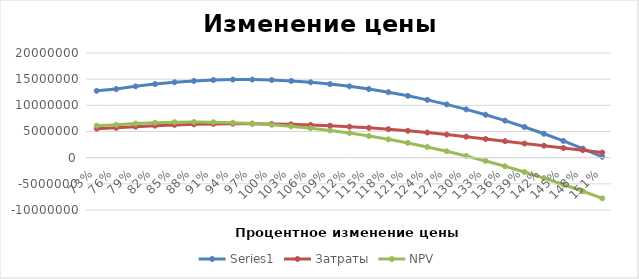
| Category | Series 0 | Затраты | NPV |
|---|---|---|---|
| 0.7299999999999998 | 12765000 | 5548890 | 6114326.627 |
| 0.7599999999999998 | 13110000 | 5698860 | 6279578.698 |
| 0.7899999999999998 | 13627500 | 5923815 | 6510931.598 |
| 0.8199999999999998 | 14058750 | 6111277.5 | 6676183.669 |
| 0.8499999999999999 | 14403750 | 6261247.5 | 6775334.911 |
| 0.8799999999999999 | 14662500 | 6373725 | 6808385.325 |
| 0.9099999999999999 | 14835000 | 6448710 | 6775334.911 |
| 0.94 | 14921250 | 6486202.5 | 6676183.669 |
| 0.97 | 14921250 | 6486202.5 | 6510931.598 |
| 1.0 | 14835000 | 6448710 | 6279578.698 |
| 1.03 | 14662500 | 6373725 | 5982124.97 |
| 1.06 | 14403750 | 6261247.5 | 5618570.414 |
| 1.09 | 14058750 | 6111277.5 | 5188915.03 |
| 1.12 | 13627500 | 5923815 | 4693158.817 |
| 1.1500000000000001 | 13110000 | 5698860 | 4131301.775 |
| 1.1800000000000002 | 12506250 | 5436412.5 | 3503343.905 |
| 1.2100000000000002 | 11816250 | 5136472.5 | 2809285.207 |
| 1.2400000000000002 | 11040000 | 4799040 | 2049125.68 |
| 1.2700000000000002 | 10177500 | 4424115 | 1222865.325 |
| 1.3000000000000003 | 9228750 | 4011697.5 | 330504.142 |
| 1.3300000000000003 | 8193750 | 3561787.5 | -627957.87 |
| 1.3600000000000003 | 7072500 | 3149370 | -1652520.71 |
| 1.3900000000000003 | 5865000 | 2699460 | -2743184.379 |
| 1.4200000000000004 | 4571250 | 2287042.5 | -3899948.876 |
| 1.4500000000000004 | 3191250 | 1837132.5 | -5122814.201 |
| 1.4800000000000004 | 1725000 | 1424715 | -6411780.355 |
| 1.5100000000000005 | 172500 | 974805 | -7766847.337 |